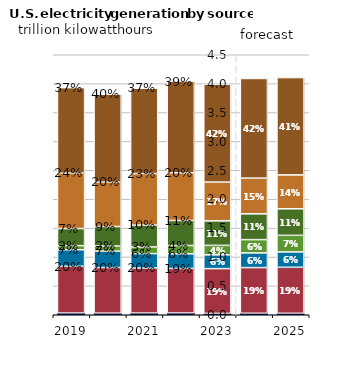
| Category | Other | Nuclear | Hydro | Solar | Wind | Coal | Natural |
|---|---|---|---|---|---|---|---|
| 2019.0 | 0.029 | 0.809 | 0.287 | 0.071 | 0.296 | 0.959 | 1.48 |
| 2020.0 | 0.027 | 0.79 | 0.284 | 0.089 | 0.337 | 0.768 | 1.522 |
| 2021.0 | 0.029 | 0.78 | 0.25 | 0.115 | 0.378 | 0.892 | 1.477 |
| 2022.0 | 0.03 | 0.772 | 0.254 | 0.143 | 0.434 | 0.826 | 1.583 |
| 2023.0 | 0.023 | 0.775 | 0.239 | 0.163 | 0.425 | 0.671 | 1.695 |
| 2024.0 | 0.025 | 0.791 | 0.254 | 0.23 | 0.447 | 0.617 | 1.725 |
| 2025.0 | 0.025 | 0.797 | 0.266 | 0.287 | 0.46 | 0.587 | 1.684 |